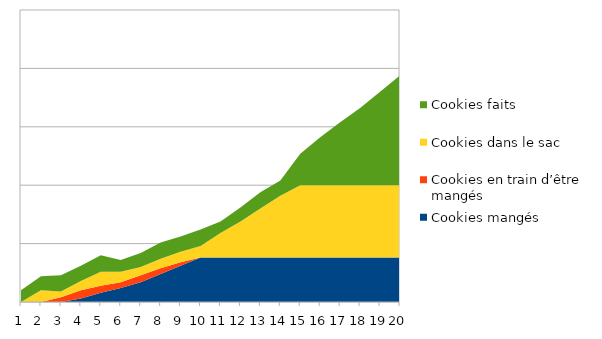
| Category | Cookies mangés | Cookies en train d’être mangés | Cookies dans le sac  | Cookies faits |
|---|---|---|---|---|
| 1 | 0 | 0 | 0 | 10 |
| 2 | 0 | 0 | 10 | 12 |
| 3 | 0 | 4 | 5 | 14 |
| 4 | 3 | 7 | 8 | 13 |
| 5 | 8 | 6 | 12 | 14 |
| 6 | 12 | 5 | 9 | 10 |
| 7 | 17 | 6 | 7 | 12 |
| 8 | 24 | 5 | 8 | 14 |
| 9 | 31 | 3 | 9 | 13 |
| 10 | 38 | 0 | 10 | 14 |
| 11 | 38 | 0 | 21 | 10 |
| 12 | 38 | 0 | 31 | 12 |
| 13 | 38 | 0 | 42 | 14 |
| 14 | 38 | 0 | 53 | 13 |
| 15 | 38 | 0 | 62 | 27 |
| 16 | 38 | 0 | 62 | 41 |
| 17 | 38 | 0 | 62 | 54 |
| 18 | 38 | 0 | 62 | 66 |
| 19 | 38 | 0 | 62 | 80 |
| 20 | 38 | 0 | 62 | 94 |